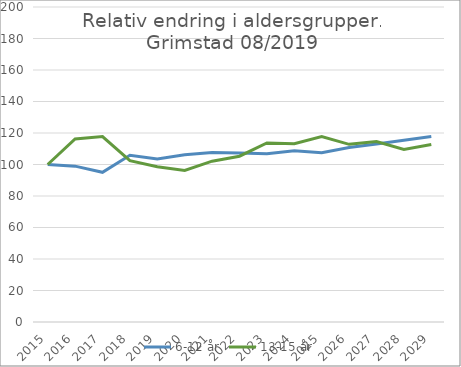
| Category | 6-12 år | 13-15 år |
|---|---|---|
| 2015.0 | 100 | 100 |
| 2016.0 | 98.957 | 116.205 |
| 2017.0 | 95.049 | 117.712 |
| 2018.0 | 105.911 | 102.399 |
| 2019.0 | 103.486 | 98.581 |
| 2020.0 | 106.221 | 96.262 |
| 2021.0 | 107.611 | 102.112 |
| 2022.0 | 107.309 | 105.278 |
| 2023.0 | 106.898 | 113.718 |
| 2024.0 | 108.691 | 113.21 |
| 2025.0 | 107.503 | 117.788 |
| 2026.0 | 110.773 | 112.793 |
| 2027.0 | 113.08 | 114.635 |
| 2028.0 | 115.435 | 109.618 |
| 2029.0 | 117.765 | 112.745 |